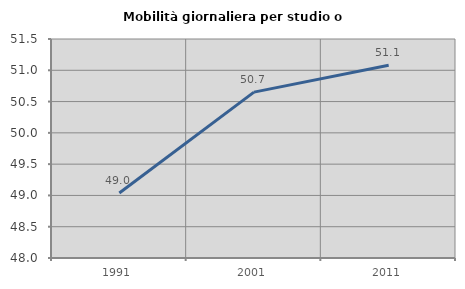
| Category | Mobilità giornaliera per studio o lavoro |
|---|---|
| 1991.0 | 49.04 |
| 2001.0 | 50.651 |
| 2011.0 | 51.079 |